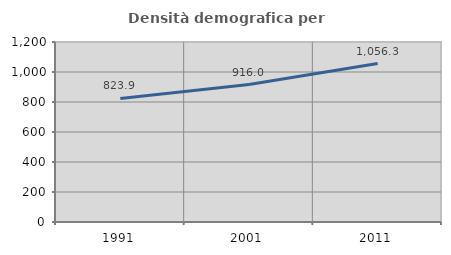
| Category | Densità demografica |
|---|---|
| 1991.0 | 823.914 |
| 2001.0 | 916.006 |
| 2011.0 | 1056.258 |